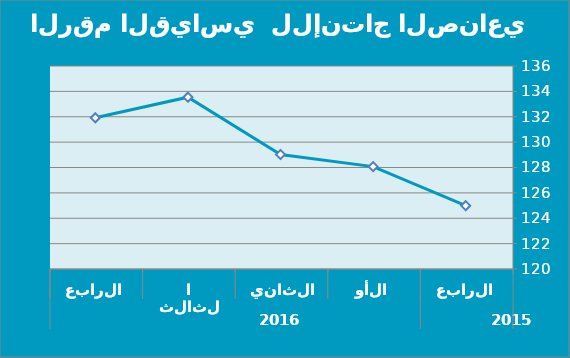
| Category | Series 0 |
|---|---|
| 0 | 124.99 |
| 1 | 128.07 |
| 2 | 129.02 |
| 3 | 133.54 |
| 4 | 131.917 |